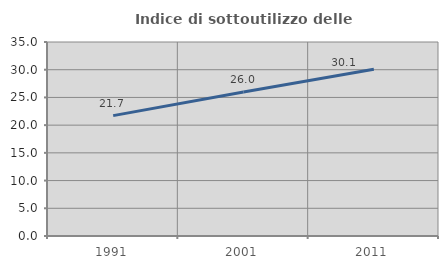
| Category | Indice di sottoutilizzo delle abitazioni  |
|---|---|
| 1991.0 | 21.719 |
| 2001.0 | 25.982 |
| 2011.0 | 30.068 |